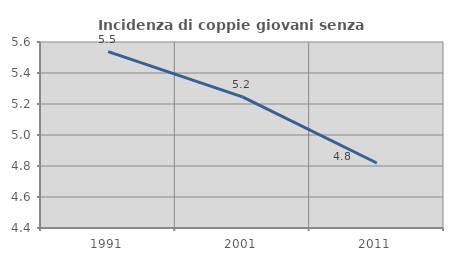
| Category | Incidenza di coppie giovani senza figli |
|---|---|
| 1991.0 | 5.537 |
| 2001.0 | 5.246 |
| 2011.0 | 4.819 |